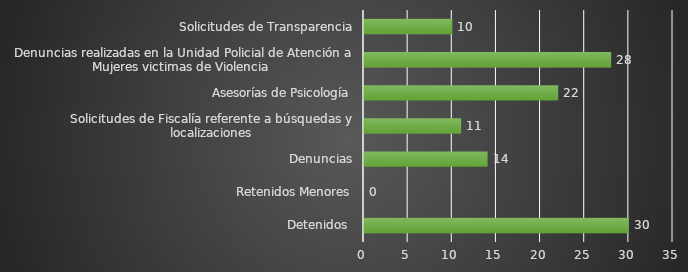
| Category | INDICADOR  |
|---|---|
| Detenidos  | 30 |
| Retenidos Menores | 0 |
| Denuncias | 14 |
| Solicitudes de Fiscalía referente a búsquedas y localizaciones | 11 |
| Asesorías de Psicología | 22 |
| Denuncias realizadas en la Unidad Policial de Atención a Mujeres victimas de Violencia  | 28 |
| Solicitudes de Transparencia | 10 |